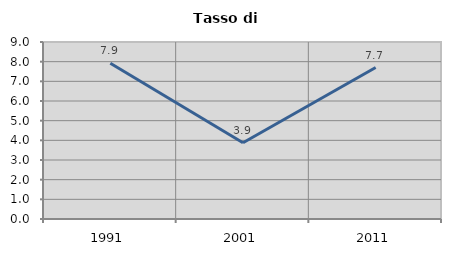
| Category | Tasso di disoccupazione   |
|---|---|
| 1991.0 | 7.92 |
| 2001.0 | 3.88 |
| 2011.0 | 7.701 |